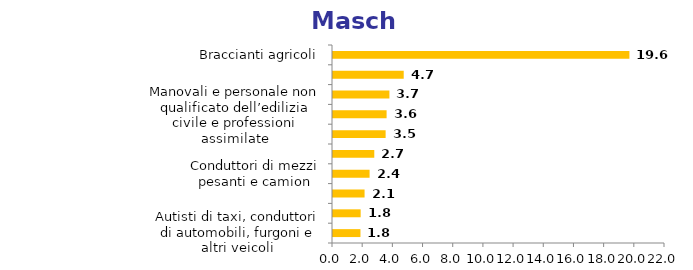
| Category | Series 0 |
|---|---|
| Braccianti agricoli | 19.642 |
| Camerieri e professioni assimilate | 4.686 |
| Registi, direttori artistici, attori, sceneggiatori e scenografi | 3.738 |
| Manovali e personale non qualificato dell’edilizia civile e professioni assimilate | 3.552 |
| Cuochi in alberghi e ristoranti | 3.487 |
| Facchini, addetti allo spostamento merci ed assimilati | 2.736 |
| Conduttori di mezzi pesanti e camion | 2.424 |
| Commessi delle vendite al minuto | 2.092 |
| Operatori di apparecchi per la ripresa e la produzione audio-video | 1.833 |
| Autisti di taxi, conduttori di automobili, furgoni e altri veicoli | 1.82 |